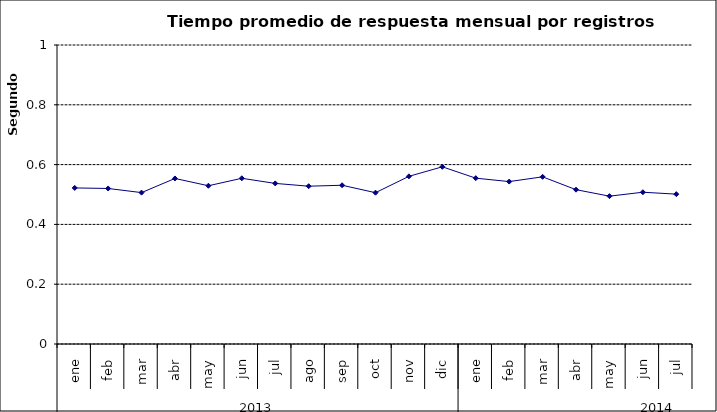
| Category | Tiempo promedio de respuesta por registros cámara PH ** |
|---|---|
| 0 | 0.522 |
| 1 | 0.52 |
| 2 | 0.506 |
| 3 | 0.554 |
| 4 | 0.529 |
| 5 | 0.554 |
| 6 | 0.537 |
| 7 | 0.528 |
| 8 | 0.531 |
| 9 | 0.506 |
| 10 | 0.561 |
| 11 | 0.593 |
| 12 | 0.555 |
| 13 | 0.543 |
| 14 | 0.559 |
| 15 | 0.516 |
| 16 | 0.494 |
| 17 | 0.508 |
| 18 | 0.501 |